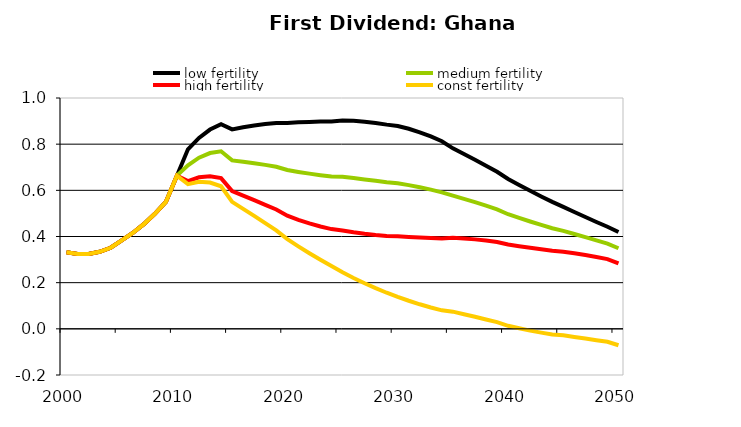
| Category | low fertility | medium fertility | high fertility | const fertility |
|---|---|---|---|---|
| 2000.0 | 0.331 | 0.331 | 0.331 | 0.331 |
| 2001.0 | 0.324 | 0.324 | 0.324 | 0.324 |
| 2002.0 | 0.325 | 0.325 | 0.325 | 0.325 |
| 2003.0 | 0.334 | 0.334 | 0.334 | 0.334 |
| 2004.0 | 0.351 | 0.351 | 0.351 | 0.351 |
| 2005.0 | 0.383 | 0.383 | 0.383 | 0.383 |
| 2006.0 | 0.415 | 0.415 | 0.415 | 0.415 |
| 2007.0 | 0.454 | 0.454 | 0.454 | 0.454 |
| 2008.0 | 0.498 | 0.498 | 0.498 | 0.498 |
| 2009.0 | 0.55 | 0.55 | 0.55 | 0.55 |
| 2010.0 | 0.664 | 0.664 | 0.664 | 0.664 |
| 2011.0 | 0.778 | 0.709 | 0.64 | 0.627 |
| 2012.0 | 0.827 | 0.741 | 0.656 | 0.637 |
| 2013.0 | 0.863 | 0.761 | 0.661 | 0.634 |
| 2014.0 | 0.887 | 0.769 | 0.653 | 0.618 |
| 2015.0 | 0.864 | 0.73 | 0.597 | 0.55 |
| 2016.0 | 0.873 | 0.724 | 0.577 | 0.52 |
| 2017.0 | 0.881 | 0.718 | 0.557 | 0.489 |
| 2018.0 | 0.887 | 0.71 | 0.537 | 0.458 |
| 2019.0 | 0.892 | 0.702 | 0.517 | 0.426 |
| 2020.0 | 0.892 | 0.688 | 0.49 | 0.388 |
| 2021.0 | 0.894 | 0.68 | 0.472 | 0.357 |
| 2022.0 | 0.896 | 0.672 | 0.457 | 0.328 |
| 2023.0 | 0.898 | 0.666 | 0.443 | 0.299 |
| 2024.0 | 0.899 | 0.66 | 0.432 | 0.272 |
| 2025.0 | 0.903 | 0.658 | 0.426 | 0.245 |
| 2026.0 | 0.901 | 0.653 | 0.418 | 0.22 |
| 2027.0 | 0.897 | 0.647 | 0.412 | 0.198 |
| 2028.0 | 0.892 | 0.641 | 0.406 | 0.176 |
| 2029.0 | 0.885 | 0.635 | 0.402 | 0.156 |
| 2030.0 | 0.879 | 0.631 | 0.401 | 0.138 |
| 2031.0 | 0.867 | 0.623 | 0.398 | 0.122 |
| 2032.0 | 0.852 | 0.613 | 0.395 | 0.106 |
| 2033.0 | 0.834 | 0.603 | 0.393 | 0.093 |
| 2034.0 | 0.813 | 0.591 | 0.391 | 0.08 |
| 2035.0 | 0.782 | 0.577 | 0.394 | 0.074 |
| 2036.0 | 0.757 | 0.563 | 0.391 | 0.063 |
| 2037.0 | 0.732 | 0.549 | 0.388 | 0.052 |
| 2038.0 | 0.707 | 0.533 | 0.383 | 0.041 |
| 2039.0 | 0.68 | 0.517 | 0.376 | 0.029 |
| 2040.0 | 0.649 | 0.497 | 0.365 | 0.013 |
| 2041.0 | 0.623 | 0.48 | 0.358 | 0.002 |
| 2042.0 | 0.598 | 0.465 | 0.351 | -0.008 |
| 2043.0 | 0.574 | 0.45 | 0.344 | -0.017 |
| 2044.0 | 0.55 | 0.436 | 0.338 | -0.024 |
| 2045.0 | 0.528 | 0.425 | 0.334 | -0.028 |
| 2046.0 | 0.506 | 0.411 | 0.327 | -0.035 |
| 2047.0 | 0.484 | 0.397 | 0.32 | -0.042 |
| 2048.0 | 0.463 | 0.383 | 0.311 | -0.049 |
| 2049.0 | 0.442 | 0.369 | 0.302 | -0.056 |
| 2050.0 | 0.419 | 0.349 | 0.283 | -0.071 |